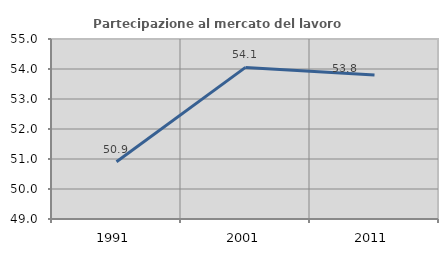
| Category | Partecipazione al mercato del lavoro  femminile |
|---|---|
| 1991.0 | 50.909 |
| 2001.0 | 54.054 |
| 2011.0 | 53.796 |